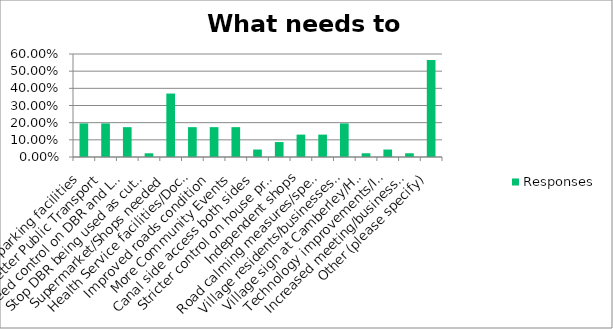
| Category | Responses |
|---|---|
| Better parking facilities | 0.196 |
| Better Public Transport | 0.196 |
| Speed control on DBR and Lake Road | 0.174 |
| Stop DBR being used as cut through (i.e. to/from M3) | 0.022 |
| Supermarket/Shops needed | 0.37 |
| Health Service facilities/Doctors Surgery | 0.174 |
| Improved roads condition | 0.174 |
| More Community Events | 0.174 |
| Canal side access both sides | 0.044 |
| Stricter control on house provision/No more houses/limit future building | 0.087 |
| Independent shops | 0.13 |
| Road calming measures/speed bumps/better traffic safety management | 0.13 |
| Village residents/businesses taking pride in their village | 0.196 |
| Village sign at Camberley/Heatherside end match one at Lake Rd/DBR | 0.022 |
| Technology improvements/Internet Speed | 0.044 |
| Increased meeting/business facilities due to increased home-working | 0.022 |
| Other (please specify) | 0.565 |